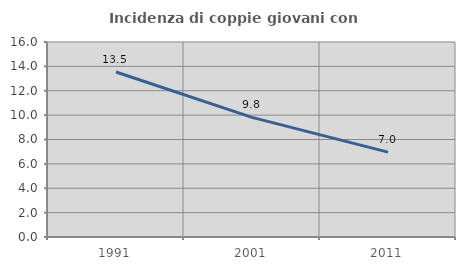
| Category | Incidenza di coppie giovani con figli |
|---|---|
| 1991.0 | 13.537 |
| 2001.0 | 9.814 |
| 2011.0 | 6.965 |